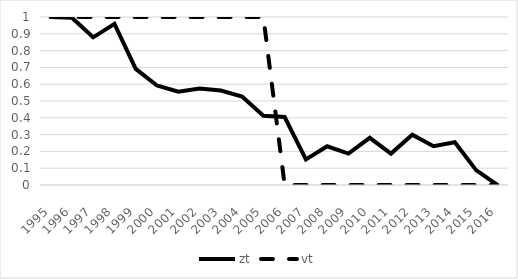
| Category | zt | vt |
|---|---|---|
| 1995-01-01 | 1 | 1 |
| 1996-01-01 | 0.996 | 1 |
| 1997-01-01 | 0.879 | 1 |
| 1998-01-01 | 0.96 | 1 |
| 1999-01-01 | 0.691 | 1 |
| 2000-01-01 | 0.592 | 1 |
| 2001-01-01 | 0.556 | 1 |
| 2002-01-01 | 0.575 | 1 |
| 2003-01-01 | 0.562 | 1 |
| 2004-01-01 | 0.527 | 1 |
| 2005-01-01 | 0.412 | 1 |
| 2006-01-01 | 0.405 | 0 |
| 2007-01-01 | 0.152 | 0 |
| 2008-01-01 | 0.231 | 0 |
| 2009-01-01 | 0.187 | 0 |
| 2010-01-01 | 0.281 | 0 |
| 2011-01-01 | 0.187 | 0 |
| 2012-01-01 | 0.299 | 0 |
| 2013-01-01 | 0.231 | 0 |
| 2014-01-01 | 0.255 | 0 |
| 2015-01-01 | 0.088 | 0 |
| 2016-01-01 | 0 | 0 |